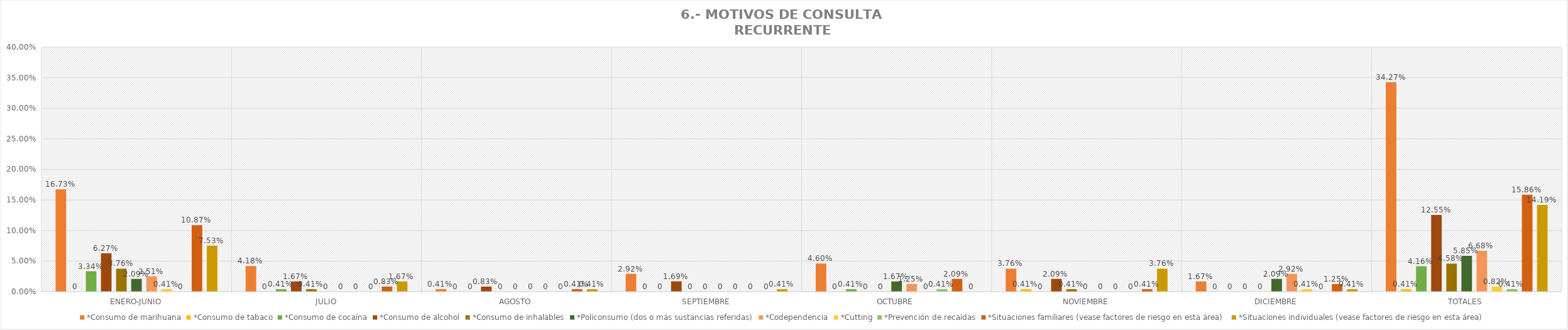
| Category | *Consumo de marihuana | *Consumo de tabaco | *Consumo de cocaína | *Consumo de alcohol | *Consumo de inhalables | *Policonsumo (dos o más sustancias referidas) | *Codependencia | *Cutting | *Prevención de recaidas | *Situaciones familiares (vease factores de riesgo en esta área) | *Situaciones individuales (vease factores de riesgo en esta área) |
|---|---|---|---|---|---|---|---|---|---|---|---|
| ENERO-JUNIO | 0.167 | 0 | 0.033 | 0.063 | 0.038 | 0.021 | 0.025 | 0.004 | 0 | 0.109 | 0.075 |
| JULIO | 0.042 | 0 | 0.004 | 0.017 | 0.004 | 0 | 0 | 0 | 0 | 0.008 | 0.017 |
| AGOSTO | 0.004 | 0 | 0 | 0.008 | 0 | 0 | 0 | 0 | 0 | 0.004 | 0.004 |
| SEPTIEMBRE | 0.029 | 0 | 0 | 0.017 | 0 | 0 | 0 | 0 | 0 | 0 | 0.004 |
| OCTUBRE | 0.046 | 0 | 0.004 | 0 | 0 | 0.017 | 0.012 | 0 | 0.004 | 0.021 | 0 |
| NOVIEMBRE | 0.038 | 0.004 | 0 | 0.021 | 0.004 | 0 | 0 | 0 | 0 | 0.004 | 0.038 |
| DICIEMBRE | 0.017 | 0 | 0 | 0 | 0 | 0.021 | 0.029 | 0.004 | 0 | 0.012 | 0.004 |
| TOTALES | 0.343 | 0.004 | 0.042 | 0.126 | 0.046 | 0.058 | 0.067 | 0.008 | 0.004 | 0.159 | 0.142 |